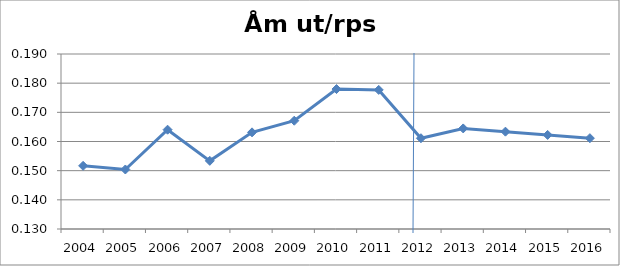
| Category | Åm ut/rps in |
|---|---|
| 2004.0 | 0.152 |
| 2005.0 | 0.15 |
| 2006.0 | 0.164 |
| 2007.0 | 0.153 |
| 2008.0 | 0.163 |
| 2009.0 | 0.167 |
| 2010.0 | 0.178 |
| 2011.0 | 0.178 |
| 2012.0 | 0.161 |
| 2013.0 | 0.164 |
| 2014.0 | 0.163 |
| 2015.0 | 0.162 |
| 2016.0 | 0.161 |